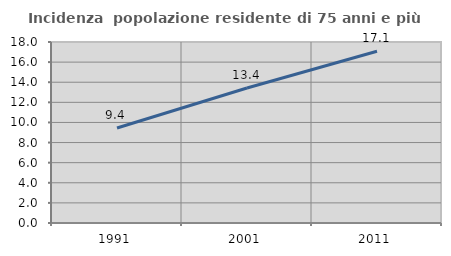
| Category | Incidenza  popolazione residente di 75 anni e più |
|---|---|
| 1991.0 | 9.449 |
| 2001.0 | 13.428 |
| 2011.0 | 17.084 |